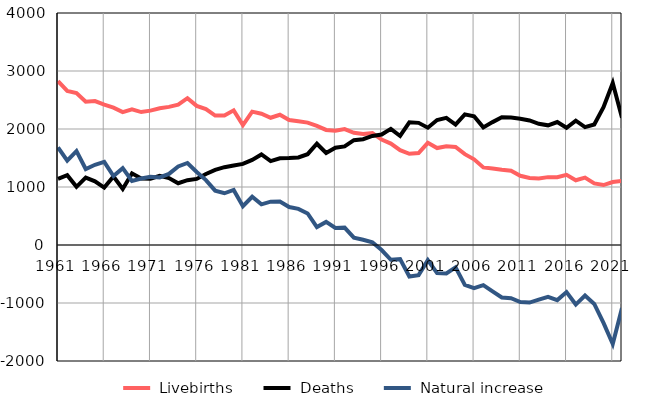
| Category |  Livebirths |  Deaths |  Natural increase |
|---|---|---|---|
| 1961.0 | 2825 | 1142 | 1683 |
| 1962.0 | 2657 | 1204 | 1453 |
| 1963.0 | 2621 | 1003 | 1618 |
| 1964.0 | 2471 | 1161 | 1310 |
| 1965.0 | 2481 | 1098 | 1383 |
| 1966.0 | 2421 | 989 | 1432 |
| 1967.0 | 2369 | 1181 | 1188 |
| 1968.0 | 2291 | 966 | 1325 |
| 1969.0 | 2338 | 1235 | 1103 |
| 1970.0 | 2292 | 1145 | 1147 |
| 1971.0 | 2317 | 1142 | 1175 |
| 1972.0 | 2358 | 1193 | 1165 |
| 1973.0 | 2381 | 1155 | 1226 |
| 1974.0 | 2420 | 1065 | 1355 |
| 1975.0 | 2531 | 1117 | 1414 |
| 1976.0 | 2399 | 1139 | 1260 |
| 1977.0 | 2343 | 1224 | 1119 |
| 1978.0 | 2232 | 1295 | 937 |
| 1979.0 | 2234 | 1342 | 892 |
| 1980.0 | 2322 | 1372 | 950 |
| 1981.0 | 2068 | 1399 | 669 |
| 1982.0 | 2299 | 1468 | 831 |
| 1983.0 | 2263 | 1562 | 701 |
| 1984.0 | 2194 | 1447 | 747 |
| 1985.0 | 2246 | 1495 | 751 |
| 1986.0 | 2155 | 1500 | 655 |
| 1987.0 | 2133 | 1510 | 623 |
| 1988.0 | 2110 | 1566 | 544 |
| 1989.0 | 2055 | 1746 | 309 |
| 1990.0 | 1984 | 1586 | 398 |
| 1991.0 | 1970 | 1677 | 293 |
| 1992.0 | 1998 | 1699 | 299 |
| 1993.0 | 1934 | 1808 | 126 |
| 1994.0 | 1915 | 1824 | 91 |
| 1995.0 | 1928 | 1880 | 48 |
| 1996.0 | 1817 | 1904 | -87 |
| 1997.0 | 1748 | 2003 | -255 |
| 1998.0 | 1636 | 1880 | -244 |
| 1999.0 | 1573 | 2116 | -543 |
| 2000.0 | 1586 | 2106 | -520 |
| 2001.0 | 1762 | 2022 | -260 |
| 2002.0 | 1671 | 2155 | -484 |
| 2003.0 | 1703 | 2193 | -490 |
| 2004.0 | 1689 | 2075 | -386 |
| 2005.0 | 1566 | 2253 | -687 |
| 2006.0 | 1477 | 2219 | -742 |
| 2007.0 | 1337 | 2028 | -691 |
| 2008.0 | 1319 | 2119 | -800 |
| 2009.0 | 1296 | 2201 | -905 |
| 2010.0 | 1280 | 2197 | -917 |
| 2011.0 | 1194 | 2178 | -984 |
| 2012.0 | 1155 | 2147 | -992 |
| 2013.0 | 1148 | 2089 | -941 |
| 2014.0 | 1170 | 2063 | -893 |
| 2015.0 | 1170 | 2120 | -950 |
| 2016.0 | 1209 | 2021 | -812 |
| 2017.0 | 1116 | 2143 | -1027 |
| 2018.0 | 1162 | 2033 | -871 |
| 2019.0 | 1061 | 2077 | -1016 |
| 2020.0 | 1034 | 2377 | -1343 |
| 2021.0 | 1086 | 2793 | -1707 |
| 2022.0 | 1106 | 2194 | -1088 |